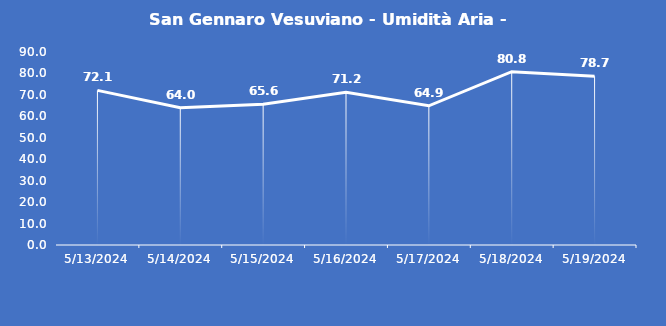
| Category | San Gennaro Vesuviano - Umidità Aria - Grezzo (%) |
|---|---|
| 5/13/24 | 72.1 |
| 5/14/24 | 64 |
| 5/15/24 | 65.6 |
| 5/16/24 | 71.2 |
| 5/17/24 | 64.9 |
| 5/18/24 | 80.8 |
| 5/19/24 | 78.7 |